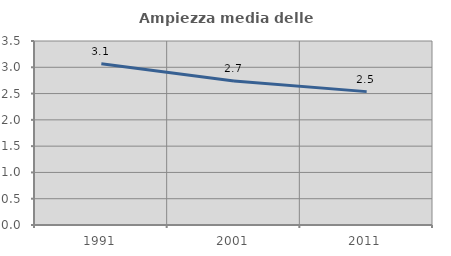
| Category | Ampiezza media delle famiglie |
|---|---|
| 1991.0 | 3.066 |
| 2001.0 | 2.739 |
| 2011.0 | 2.537 |